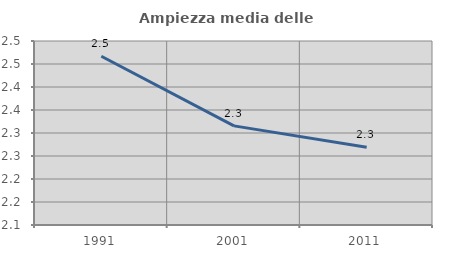
| Category | Ampiezza media delle famiglie |
|---|---|
| 1991.0 | 2.467 |
| 2001.0 | 2.315 |
| 2011.0 | 2.269 |